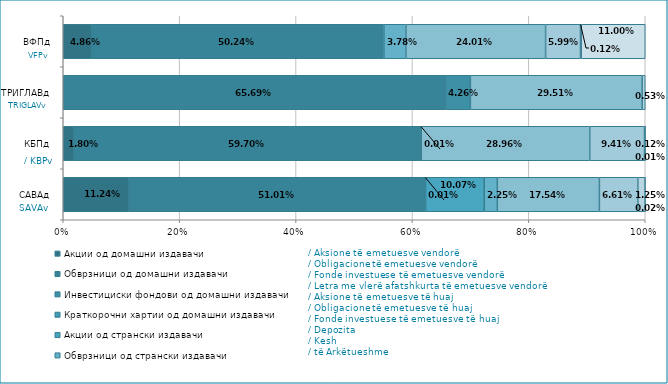
| Category | Акции од домашни издавачи  | Обврзници од домашни издавачи  | Инвестициски фондови од домашни издавачи   | Краткорочни хартии од домашни издавачи   | Акции од странски издавачи   | Обврзници од странски издавачи  | Инвестициски фондови од странски издавчи  | Депозити | Парични средства | Побарувања |
|---|---|---|---|---|---|---|---|---|---|---|
| САВАд | 0.112 | 0.51 | 0 | 0 | 0.101 | 0.023 | 0.175 | 0.066 | 0.013 | 0 |
| КБПд | 0.018 | 0.597 | 0 | 0 | 0 | 0 | 0.29 | 0.094 | 0.001 | 0 |
| ТРИГЛАВд | 0 | 0.657 | 0.043 | 0 | 0 | 0 | 0.295 | 0 | 0.005 | 0 |
| ВФПд | 0.049 | 0.502 | 0 | 0 | 0 | 0.038 | 0.24 | 0.06 | 0.001 | 0.11 |